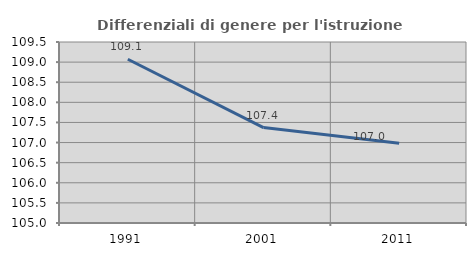
| Category | Differenziali di genere per l'istruzione superiore |
|---|---|
| 1991.0 | 109.072 |
| 2001.0 | 107.372 |
| 2011.0 | 106.984 |